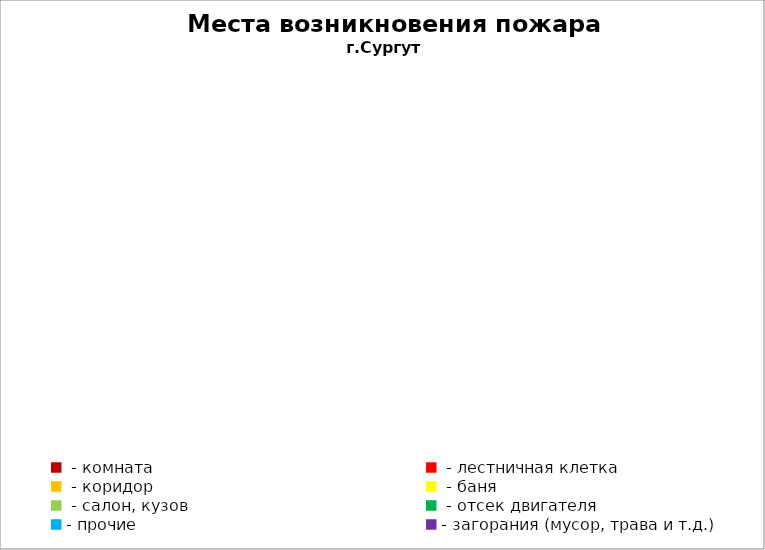
| Category | Места возникновения пожара |
|---|---|
|  - комната | 59 |
|  - лестничная клетка | 14 |
|  - коридор | 11 |
|  - баня | 34 |
|  - салон, кузов | 21 |
|  - отсек двигателя | 42 |
| - прочие | 87 |
| - загорания (мусор, трава и т.д.)  | 155 |